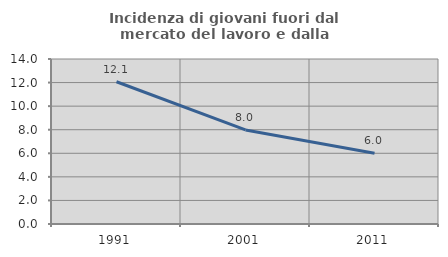
| Category | Incidenza di giovani fuori dal mercato del lavoro e dalla formazione  |
|---|---|
| 1991.0 | 12.069 |
| 2001.0 | 7.983 |
| 2011.0 | 6 |